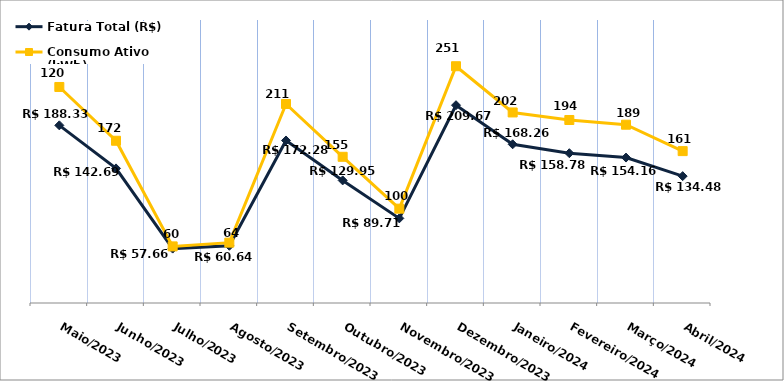
| Category | Fatura Total (R$) | Consumo Ativo (kWh) |
|---|---|---|
| Maio/2023 | 188.33 | 229 |
| Junho/2023 | 142.69 | 172 |
| Julho/2023 | 57.66 | 60 |
| Agosto/2023 | 60.64 | 64 |
| Setembro/2023 | 172.28 | 211 |
| Outubro/2023 | 129.95 | 155 |
| Novembro/2023 | 89.71 | 100 |
| Dezembro/2023 | 209.67 | 251 |
| Janeiro/2024 | 168.26 | 202 |
| Fevereiro/2024 | 158.78 | 194 |
| Março/2024 | 154.16 | 189 |
| Abril/2024 | 134.48 | 161 |